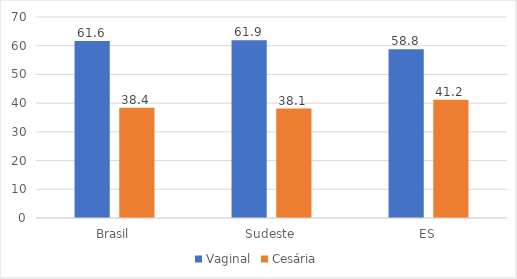
| Category | Vaginal | Cesária |
|---|---|---|
| Brasil | 61.6 | 38.4 |
| Sudeste | 61.9 | 38.1 |
| ES | 58.8 | 41.2 |